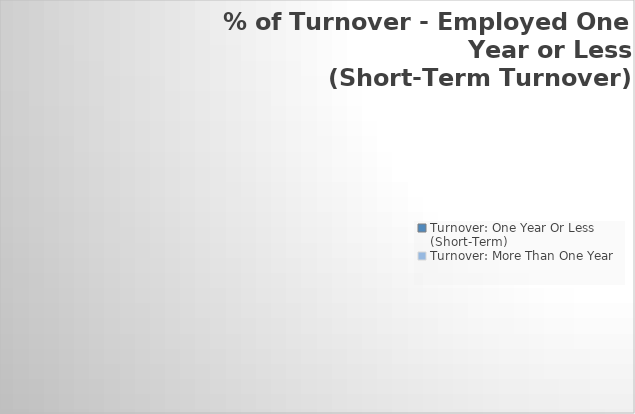
| Category | Series 0 |
|---|---|
| Turnover: One Year Or Less        (Short-Term) | 0 |
| Turnover: More Than One Year | 0 |